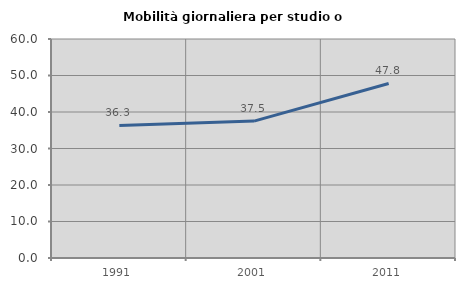
| Category | Mobilità giornaliera per studio o lavoro |
|---|---|
| 1991.0 | 36.327 |
| 2001.0 | 37.505 |
| 2011.0 | 47.826 |